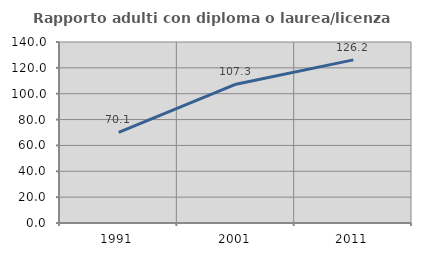
| Category | Rapporto adulti con diploma o laurea/licenza media  |
|---|---|
| 1991.0 | 70.053 |
| 2001.0 | 107.339 |
| 2011.0 | 126.16 |